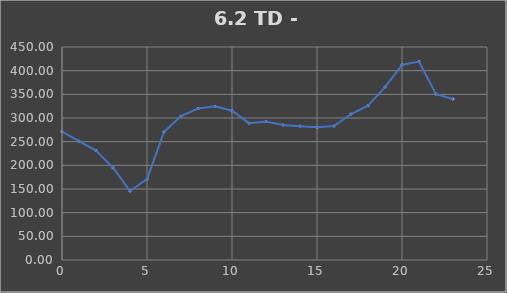
| Category | TOTAL |
|---|---|
| 0.0 | 271.004 |
| 1.0 | 250.994 |
| 2.0 | 231.224 |
| 3.0 | 194.874 |
| 4.0 | 145.804 |
| 5.0 | 170.964 |
| 6.0 | 270.404 |
| 7.0 | 303.954 |
| 8.0 | 319.909 |
| 9.0 | 324.626 |
| 10.0 | 315.226 |
| 11.0 | 289.156 |
| 12.0 | 292.386 |
| 13.0 | 285.216 |
| 14.0 | 282.779 |
| 15.0 | 280.369 |
| 16.0 | 283.109 |
| 17.0 | 308.369 |
| 18.0 | 326.016 |
| 19.0 | 365.216 |
| 20.0 | 412.236 |
| 21.0 | 419.186 |
| 22.0 | 350.329 |
| 23.0 | 340.169 |